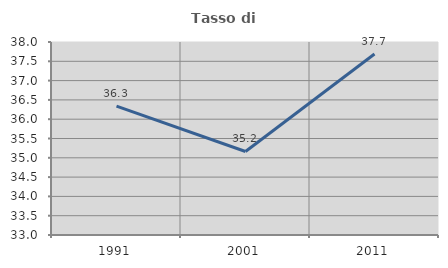
| Category | Tasso di occupazione   |
|---|---|
| 1991.0 | 36.34 |
| 2001.0 | 35.164 |
| 2011.0 | 37.69 |